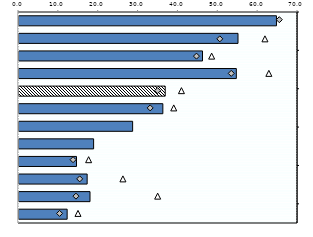
| Category | 25-64 |
|---|---|
| 0 | 64.6 |
| 1 | 54.946 |
| 2 | 46.042 |
| 3 | 54.528 |
| 4 | 36.682 |
| 5 | 36.093 |
| 6 | 28.51 |
| 7 | 18.72 |
| 8 | 14.429 |
| 9 | 17.1 |
| 10 | 17.815 |
| 11 | 12.082 |